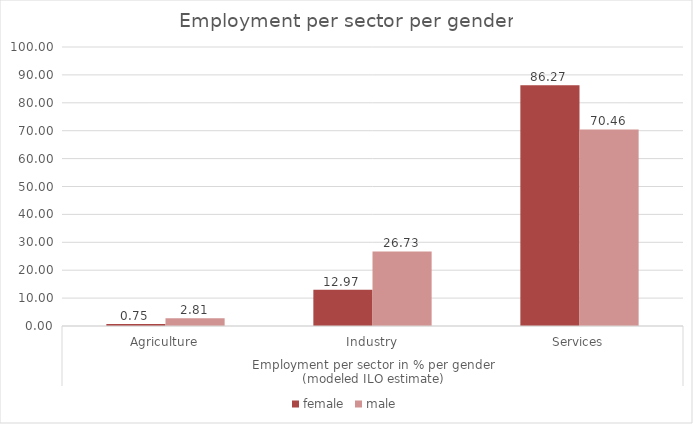
| Category | female | male |
|---|---|---|
| 0 | 0.75 | 2.81 |
| 1 | 12.97 | 26.73 |
| 2 | 86.27 | 70.46 |